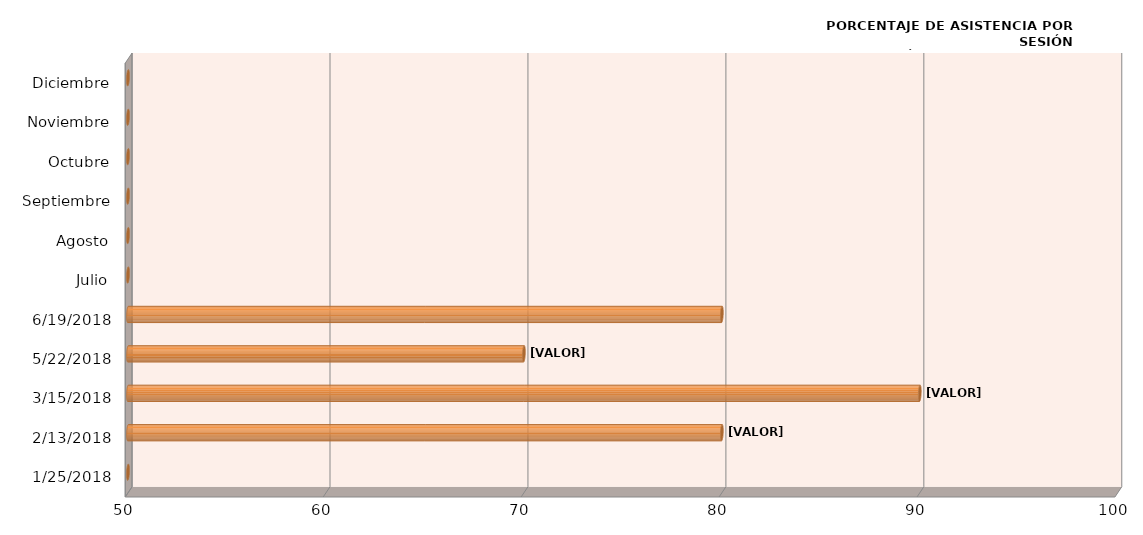
| Category | Series 0 |
|---|---|
| 25/01/2018 | 0 |
| 13/02/2018 | 80 |
| 15/03/2018 | 90 |
| 22/05/2018 | 70 |
| 19/06/2018 | 80 |
| Julio | 0 |
| Agosto | 0 |
| Septiembre | 0 |
| Octubre | 0 |
| Noviembre | 0 |
| Diciembre | 0 |